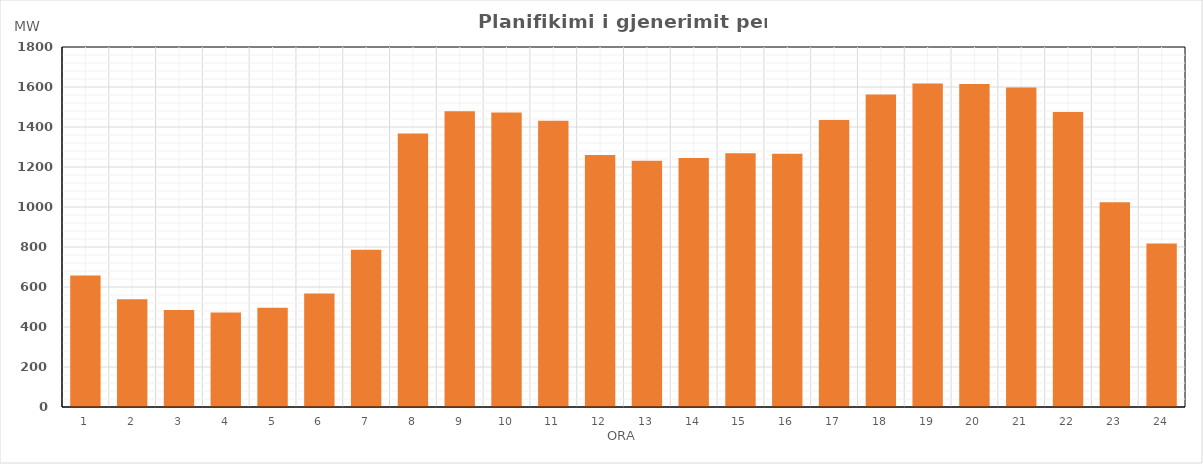
| Category | Max (MW) |
|---|---|
| 0 | 657.255 |
| 1 | 539.22 |
| 2 | 485.36 |
| 3 | 472.465 |
| 4 | 496.495 |
| 5 | 567.905 |
| 6 | 786.865 |
| 7 | 1367.394 |
| 8 | 1479.04 |
| 9 | 1473.115 |
| 10 | 1430.86 |
| 11 | 1259.68 |
| 12 | 1231.54 |
| 13 | 1245.58 |
| 14 | 1268.655 |
| 15 | 1266.595 |
| 16 | 1434.645 |
| 17 | 1562.264 |
| 18 | 1617.735 |
| 19 | 1614.78 |
| 20 | 1597.7 |
| 21 | 1475.12 |
| 22 | 1023.125 |
| 23 | 818.055 |